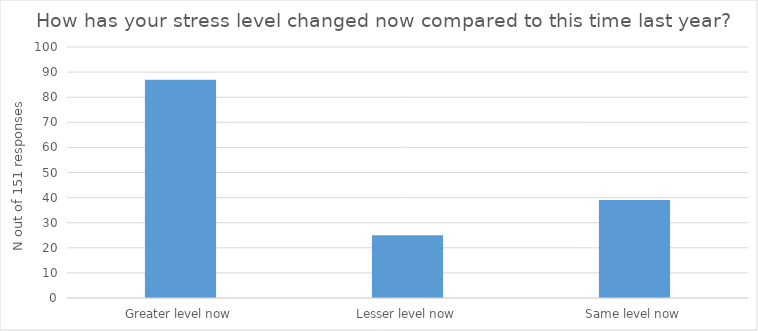
| Category | Series 0 |
|---|---|
| Greater level now | 87 |
| Lesser level now | 25 |
| Same level now | 39 |